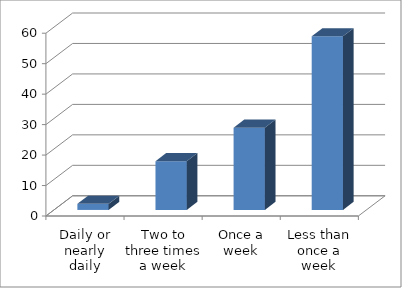
| Category | Series 0 |
|---|---|
| Daily or nearly daily | 2 |
| Two to three times a week | 16 |
| Once a week | 27 |
| Less than once a week | 57 |